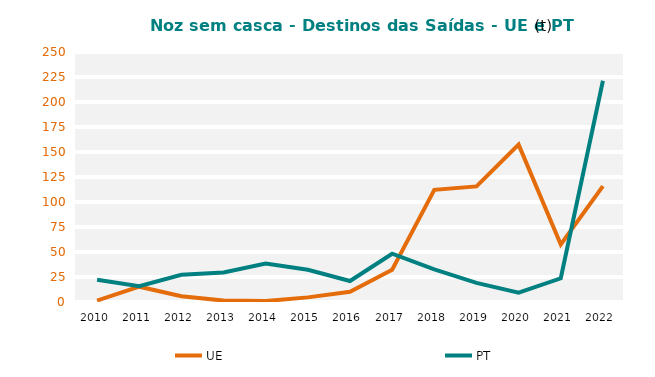
| Category | UE | PT |
|---|---|---|
| 2010.0 | 1.472 | 22.266 |
| 2011.0 | 15.307 | 15.835 |
| 2012.0 | 5.744 | 27.146 |
| 2013.0 | 1.389 | 29.52 |
| 2014.0 | 0.91 | 38.561 |
| 2015.0 | 4.628 | 32.188 |
| 2016.0 | 10.164 | 20.974 |
| 2017.0 | 32.193 | 48.287 |
| 2018.0 | 112.18 | 32.58 |
| 2019.0 | 115.591 | 19.165 |
| 2020.0 | 157.392 | 9.279 |
| 2021.0 | 57.592 | 23.717 |
| 2022.0 | 115.898 | 221.233 |